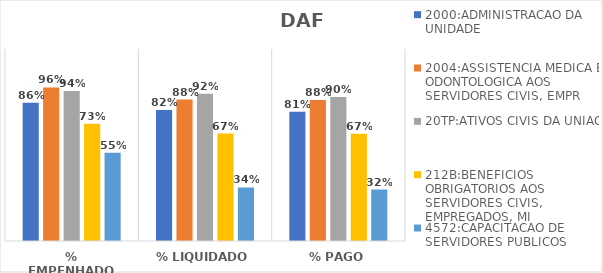
| Category | 2000:ADMINISTRACAO DA UNIDADE | 2004:ASSISTENCIA MEDICA E ODONTOLOGICA AOS SERVIDORES CIVIS, EMPR | 20TP:ATIVOS CIVIS DA UNIAO | 212B:BENEFICIOS OBRIGATORIOS AOS SERVIDORES CIVIS, EMPREGADOS, MI | 4572:CAPACITACAO DE SERVIDORES PUBLICOS FEDERAIS EM PROCESSO DE Q |
|---|---|---|---|---|---|
| % EMPENHADO | 0.865 | 0.96 | 0.938 | 0.733 | 0.552 |
| % LIQUIDADO | 0.819 | 0.884 | 0.92 | 0.671 | 0.335 |
| % PAGO | 0.807 | 0.881 | 0.9 | 0.671 | 0.322 |